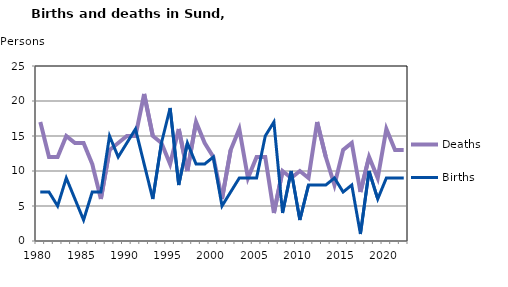
| Category | Deaths | Births |
|---|---|---|
| 1980.0 | 17 | 7 |
| 1981.0 | 12 | 7 |
| 1982.0 | 12 | 5 |
| 1983.0 | 15 | 9 |
| 1984.0 | 14 | 6 |
| 1985.0 | 14 | 3 |
| 1986.0 | 11 | 7 |
| 1987.0 | 6 | 7 |
| 1988.0 | 13 | 15 |
| 1989.0 | 14 | 12 |
| 1990.0 | 15 | 14 |
| 1991.0 | 15 | 16 |
| 1992.0 | 21 | 11 |
| 1993.0 | 15 | 6 |
| 1994.0 | 14 | 14 |
| 1995.0 | 11 | 19 |
| 1996.0 | 16 | 8 |
| 1997.0 | 10 | 14 |
| 1998.0 | 17 | 11 |
| 1999.0 | 14 | 11 |
| 2000.0 | 12 | 12 |
| 2001.0 | 6 | 5 |
| 2002.0 | 13 | 7 |
| 2003.0 | 16 | 9 |
| 2004.0 | 9 | 9 |
| 2005.0 | 12 | 9 |
| 2006.0 | 12 | 15 |
| 2007.0 | 4 | 17 |
| 2008.0 | 10 | 4 |
| 2009.0 | 9 | 10 |
| 2010.0 | 10 | 3 |
| 2011.0 | 9 | 8 |
| 2012.0 | 17 | 8 |
| 2013.0 | 12 | 8 |
| 2014.0 | 8 | 9 |
| 2015.0 | 13 | 7 |
| 2016.0 | 14 | 8 |
| 2017.0 | 7 | 1 |
| 2018.0 | 12 | 10 |
| 2019.0 | 9 | 6 |
| 2020.0 | 16 | 9 |
| 2021.0 | 13 | 9 |
| 2022.0 | 13 | 9 |